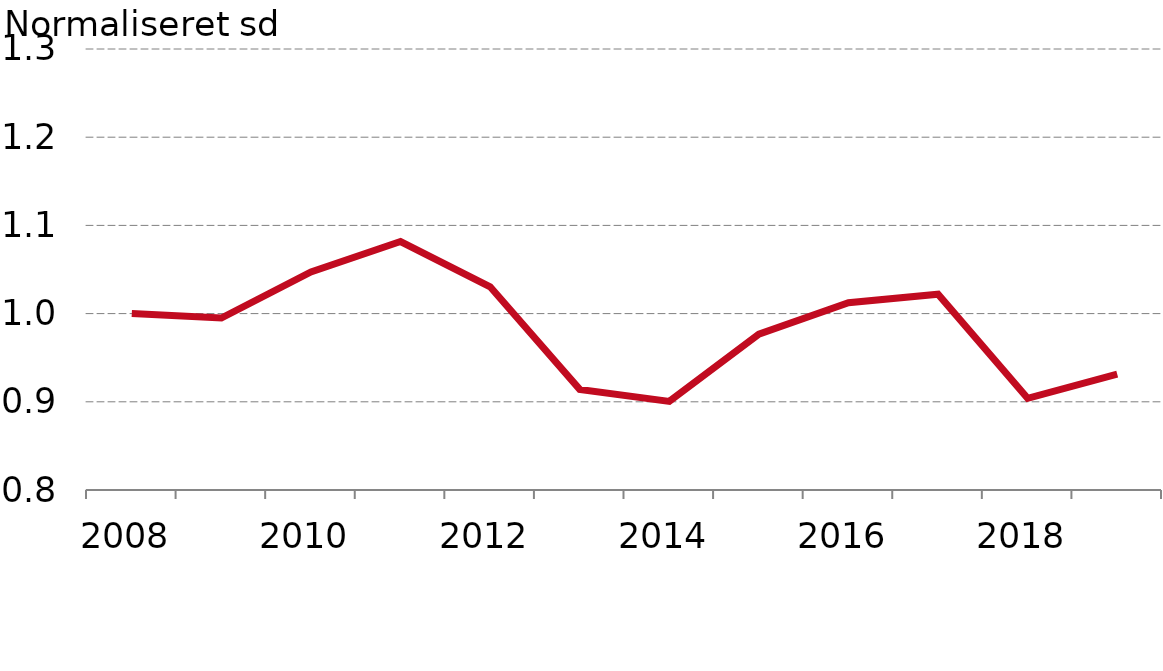
| Category |  Levetid |
|---|---|
| 2008.0 | 1 |
| 2009.0 | 0.995 |
| 2010.0 | 1.047 |
| 2011.0 | 1.082 |
| 2012.0 | 1.03 |
| 2013.0 | 0.914 |
| 2014.0 | 0.901 |
| 2015.0 | 0.977 |
| 2016.0 | 1.012 |
| 2017.0 | 1.022 |
| 2018.0 | 0.904 |
| 2019.0 | 0.931 |